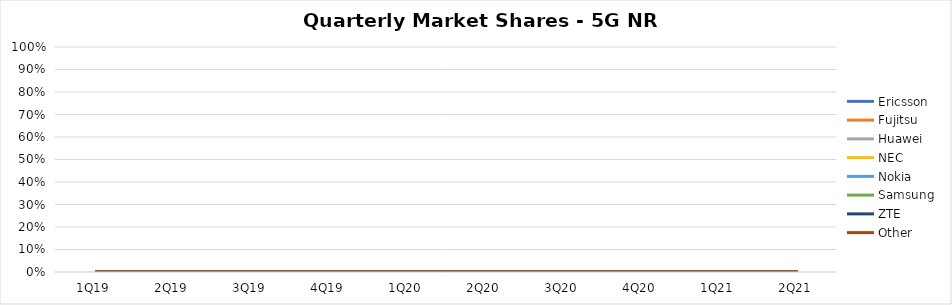
| Category | Ericsson | Fujitsu | Huawei | NEC | Nokia | Samsung | ZTE | Other |
|---|---|---|---|---|---|---|---|---|
| 1Q19 | 0 | 0 | 0 | 0 | 0 | 0 | 0 | 0 |
| 2Q19 | 0 | 0 | 0 | 0 | 0 | 0 | 0 | 0 |
| 3Q19 | 0 | 0 | 0 | 0 | 0 | 0 | 0 | 0 |
| 4Q19 | 0 | 0 | 0 | 0 | 0 | 0 | 0 | 0 |
| 1Q20 | 0 | 0 | 0 | 0 | 0 | 0 | 0 | 0 |
| 2Q20 | 0 | 0 | 0 | 0 | 0 | 0 | 0 | 0 |
| 3Q20 | 0 | 0 | 0 | 0 | 0 | 0 | 0 | 0 |
| 4Q20 | 0 | 0 | 0 | 0 | 0 | 0 | 0 | 0 |
| 1Q21 | 0 | 0 | 0 | 0 | 0 | 0 | 0 | 0 |
| 2Q21 | 0 | 0 | 0 | 0 | 0 | 0 | 0 | 0 |